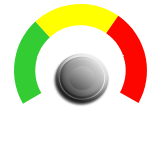
| Category | PIE |
|---|---|
| 0 | 0 |
| 1 | 0.56 |
| 2 | 41.44 |